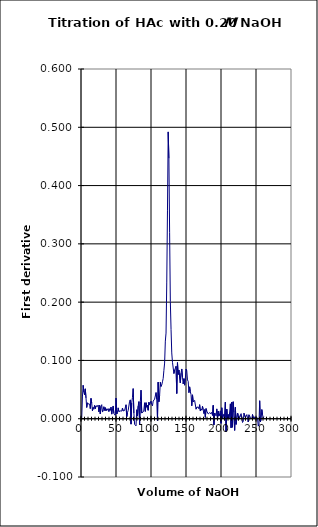
| Category | Series 0 |
|---|---|
| 1.018 | 0.001 |
| 2.0389999999999997 | 0.037 |
| 3.06 | 0.057 |
| 4.081 | 0.046 |
| 5.1015 | 0.041 |
| 6.1225000000000005 | 0.051 |
| 7.1434999999999995 | 0.036 |
| 8.1645 | 0.019 |
| 9.185500000000001 | 0.027 |
| 10.2065 | 0.026 |
| 11.2275 | 0.025 |
| 12.2485 | 0.025 |
| 13.2695 | 0.017 |
| 14.2905 | 0.035 |
| 15.311499999999999 | 0.027 |
| 16.3325 | 0.013 |
| 17.353 | 0.02 |
| 18.374000000000002 | 0.016 |
| 19.395000000000003 | 0.023 |
| 20.416 | 0.017 |
| 21.4375 | 0.022 |
| 22.458 | 0.023 |
| 23.4785 | 0.021 |
| 24.4995 | 0.023 |
| 25.5205 | 0.012 |
| 26.5415 | 0.023 |
| 27.5625 | 0.008 |
| 28.5835 | 0.022 |
| 29.6045 | 0.024 |
| 30.6255 | 0.011 |
| 31.646499999999996 | 0.015 |
| 32.6675 | 0.021 |
| 33.6885 | 0.014 |
| 34.7095 | 0.019 |
| 35.7305 | 0.013 |
| 36.7515 | 0.017 |
| 37.7725 | 0.015 |
| 38.7935 | 0.017 |
| 39.814 | 0.012 |
| 40.8345 | 0.017 |
| 41.8555 | 0.014 |
| 42.8765 | 0.02 |
| 43.8975 | 0.008 |
| 44.9185 | 0.018 |
| 45.9395 | 0.022 |
| 46.960499999999996 | 0.009 |
| 47.9815 | 0.008 |
| 49.0025 | 0.006 |
| 50.0235 | 0.035 |
| 51.0445 | 0.008 |
| 52.0655 | 0.011 |
| 53.0865 | 0.019 |
| 54.1075 | 0.012 |
| 55.1285 | 0.014 |
| 56.1495 | 0.013 |
| 57.1705 | 0.014 |
| 58.1915 | 0.013 |
| 59.2125 | 0.018 |
| 60.2335 | 0.013 |
| 61.2545 | 0.012 |
| 62.2755 | 0.014 |
| 63.2965 | 0.015 |
| 64.3175 | 0.024 |
| 65.33850000000001 | 0.004 |
| 66.3595 | 0.011 |
| 67.38050000000001 | 0.014 |
| 68.4015 | 0.014 |
| 69.42250000000001 | 0.03 |
| 70.4435 | 0.032 |
| 71.46449999999999 | -0.009 |
| 72.4855 | 0.027 |
| 73.50649999999999 | 0.036 |
| 74.5275 | 0.052 |
| 75.54849999999999 | 0.01 |
| 76.5695 | -0.01 |
| 77.59049999999999 | -0.01 |
| 78.6115 | -0.012 |
| 79.6325 | 0.015 |
| 80.65350000000001 | 0.005 |
| 81.674 | 0.022 |
| 82.695 | 0.029 |
| 83.7165 | -0.01 |
| 84.73750000000001 | 0.029 |
| 85.7585 | 0.049 |
| 86.779 | 0.01 |
| 87.80000000000001 | 0.01 |
| 88.821 | 0.012 |
| 89.842 | 0.015 |
| 90.863 | 0.027 |
| 91.8835 | 0.013 |
| 92.90450000000001 | 0.027 |
| 93.9255 | 0.02 |
| 94.9465 | 0.023 |
| 95.9675 | 0.014 |
| 96.98849999999999 | 0.028 |
| 98.0095 | 0.024 |
| 99.03049999999999 | 0.025 |
| 100.0515 | 0.03 |
| 101.07249999999999 | 0.025 |
| 102.0935 | 0.022 |
| 103.11449999999999 | 0.03 |
| 104.13550000000001 | 0.03 |
| 105.1565 | 0.034 |
| 106.17750000000001 | 0.034 |
| 107.1985 | 0.045 |
| 108.219 | 0.033 |
| 109.23949999999999 | -0.003 |
| 110.26050000000001 | 0.063 |
| 111.2815 | 0.029 |
| 112.30250000000001 | 0.04 |
| 113.3235 | 0.063 |
| 114.34450000000001 | 0.055 |
| 115.3655 | 0.058 |
| 116.38650000000001 | 0.063 |
| 117.4075 | 0.069 |
| 118.4285 | 0.083 |
| 119.4495 | 0.095 |
| 120.47049999999999 | 0.133 |
| 121.4915 | 0.147 |
| 122.51249999999999 | 0.233 |
| 123.5335 | 0.357 |
| 124.55449999999999 | 0.492 |
| 125.5755 | 0.447 |
| 126.59649999999999 | 0.319 |
| 127.618 | 0.201 |
| 128.6395 | 0.153 |
| 129.6605 | 0.113 |
| 130.6815 | 0.097 |
| 131.7025 | 0.096 |
| 132.7235 | 0.077 |
| 133.74450000000002 | 0.084 |
| 134.7655 | 0.086 |
| 135.7865 | 0.09 |
| 136.8075 | 0.043 |
| 137.82850000000002 | 0.096 |
| 138.8495 | 0.076 |
| 139.871 | 0.084 |
| 140.89249999999998 | 0.082 |
| 141.9135 | 0.061 |
| 142.9345 | 0.078 |
| 143.9555 | 0.085 |
| 144.9765 | 0.071 |
| 145.9975 | 0.06 |
| 147.019 | 0.069 |
| 148.0405 | 0.058 |
| 149.0615 | 0.069 |
| 150.08249999999998 | 0.085 |
| 151.1035 | 0.082 |
| 152.1245 | 0.067 |
| 153.1455 | 0.064 |
| 154.16649999999998 | 0.045 |
| 155.1875 | 0.055 |
| 156.20850000000002 | 0.046 |
| 157.23000000000002 | 0.041 |
| 158.25150000000002 | 0.022 |
| 159.27249999999998 | 0.041 |
| 160.2935 | 0.029 |
| 161.3145 | 0.029 |
| 162.3355 | 0.031 |
| 163.35649999999998 | 0.032 |
| 164.3775 | 0.016 |
| 165.3985 | 0.02 |
| 166.4195 | 0.021 |
| 167.441 | 0.02 |
| 168.4625 | 0.017 |
| 169.4835 | 0.024 |
| 170.5045 | 0.013 |
| 171.5255 | 0.017 |
| 172.54649999999998 | 0.015 |
| 173.5675 | 0.021 |
| 174.5885 | 0.015 |
| 175.61 | 0.009 |
| 176.63150000000002 | 0.016 |
| 177.6525 | 0.002 |
| 178.6735 | 0.017 |
| 179.6945 | 0.013 |
| 180.71550000000002 | 0.014 |
| 181.7365 | 0.008 |
| 182.7575 | 0.008 |
| 183.7785 | 0.01 |
| 184.7995 | 0.012 |
| 185.82049999999998 | 0.009 |
| 186.84199999999998 | 0.011 |
| 187.8635 | 0.006 |
| 188.8845 | 0.023 |
| 189.90550000000002 | -0.011 |
| 190.9265 | 0.01 |
| 191.9475 | 0.007 |
| 192.9685 | 0.005 |
| 193.98950000000002 | 0.017 |
| 195.01049999999998 | -0.001 |
| 196.0315 | 0.013 |
| 197.0525 | 0.005 |
| 198.0735 | 0.008 |
| 199.09449999999998 | 0.014 |
| 200.1155 | -0.008 |
| 201.1365 | 0.019 |
| 202.1575 | 0 |
| 203.17849999999999 | 0.004 |
| 204.2 | 0.008 |
| 205.2215 | 0.003 |
| 206.2425 | 0.028 |
| 207.2635 | -0.022 |
| 208.28449999999998 | 0.016 |
| 209.3055 | 0 |
| 210.3265 | 0.007 |
| 211.3475 | 0 |
| 212.36849999999998 | 0.011 |
| 213.3895 | 0.026 |
| 214.411 | -0.016 |
| 215.4325 | 0.028 |
| 216.45350000000002 | -0.015 |
| 217.4745 | 0.029 |
| 218.4955 | 0.011 |
| 219.5165 | -0.02 |
| 220.5375 | 0.02 |
| 221.55849999999998 | -0.01 |
| 222.57999999999998 | -0.01 |
| 223.6015 | 0.01 |
| 224.6225 | 0.007 |
| 225.64350000000002 | -0.001 |
| 226.6645 | -0.001 |
| 227.6855 | 0.006 |
| 228.7065 | 0.009 |
| 229.72750000000002 | 0.01 |
| 230.74849999999998 | -0.006 |
| 231.7695 | -0.005 |
| 232.791 | 0.009 |
| 233.8125 | 0.011 |
| 234.83350000000002 | 0.002 |
| 235.8545 | 0.003 |
| 236.8755 | 0.007 |
| 237.8965 | 0.008 |
| 238.91750000000002 | -0.006 |
| 239.9385 | 0.007 |
| 240.9595 | 0.005 |
| 241.981 | 0.002 |
| 243.0025 | 0.002 |
| 244.0235 | 0 |
| 245.0445 | 0.007 |
| 246.0655 | 0.001 |
| 247.0865 | 0.004 |
| 248.10750000000002 | 0.001 |
| 249.1285 | 0.001 |
| 250.1495 | 0.002 |
| 251.1705 | 0.004 |
| 252.192 | 0.001 |
| 253.2135 | -0.013 |
| 254.2345 | -0.01 |
| 255.25549999999998 | 0.031 |
| 256.2765 | -0.005 |
| 257.2975 | -0.001 |
| 258.3185 | 0.016 |
| 259.34000000000003 | 0.007 |
| 260.3615 | 0.001 |
| 261.3825 | 0.003 |